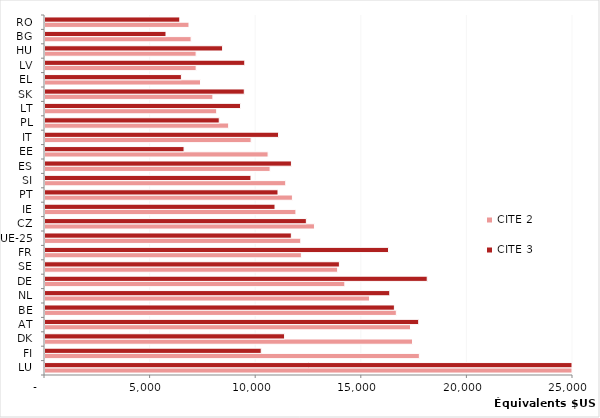
| Category | CITE 2 | CITE 3 |
|---|---|---|
| LU | 27112.04 | 26182.22 |
| FI | 17725.61 | 10237.82 |
| DK | 17401.6 | 11343.92 |
| AT | 17306.81 | 17694.75 |
| BE | 16634.8 | 16543.41 |
| NL | 15363.84 | 16324.36 |
| DE | 14196.79 | 18098 |
| SE | 13856.66 | 13939.19 |
| FR | 12138.69 | 16265.82 |
| UE-25 | 12110.736 | 11664.205 |
| CZ | 12759.65 | 12374.44 |
| IE | 11880.38 | 10890.65 |
| PT | 11715.41 | 11032.05 |
| SI | 11398.46 | 9751.994 |
| ES | 10657.96 | 11668.18 |
| EE | 10563.08 | 6583.927 |
| IT | 9760.109 | 11059.05 |
| PL | 8695.879 | 8251.07 |
| LT | 8128.486 | 9259.991 |
| SK | 7949.107 | 9436.271 |
| EL | 7364.408 | 6458.187 |
| LV | 7157.287 | 9460.003 |
| HU | 7155.465 | 8408.943 |
| BG | 6917.724 | 5728.842 |
| RO | 6817.415 | 6382.112 |